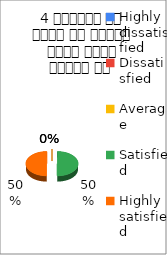
| Category | 4 शिक्षक ने विषय के प्रति रूचि रूचि जागृत की  |
|---|---|
| Highly dissatisfied | 0 |
| Dissatisfied | 0 |
| Average | 0 |
| Satisfied | 3 |
| Highly satisfied | 3 |